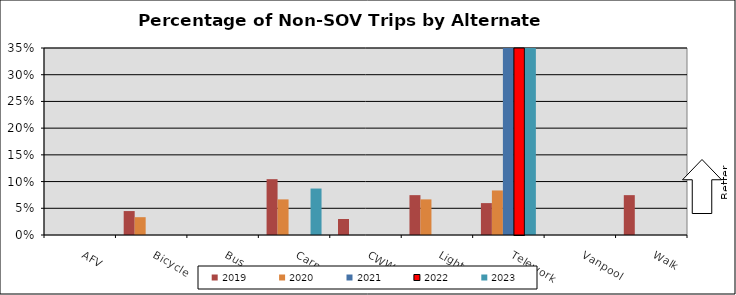
| Category | 2019 | 2020 | 2021 | 2022 | 2023 |
|---|---|---|---|---|---|
| AFV | 0 | 0 | 0 | 0 | 0 |
| Bicycle | 0.045 | 0.033 | 0 | 0 | 0 |
| Bus | 0 | 0 | 0 | 0 | 0 |
| Carpool | 0.104 | 0.067 | 0 | 0 | 0.087 |
| CWW | 0.03 | 0 | 0 | 0 | 0 |
| Light Rail | 0.075 | 0.067 | 0 | 0 | 0 |
| Telework | 0.06 | 0.083 | 0.851 | 1 | 0.587 |
| Vanpool | 0 | 0 | 0 | 0 | 0 |
| Walk | 0.075 | 0 | 0 | 0 | 0 |